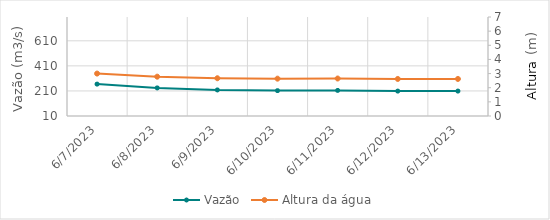
| Category | Vazão |
|---|---|
| 5/11/23 | 460.97 |
| 5/10/23 | 454.54 |
| 5/9/23 | 470.5 |
| 5/8/23 | 406.35 |
| 5/7/23 | 363.18 |
| 5/6/23 | 265.45 |
| 5/5/23 | 240.06 |